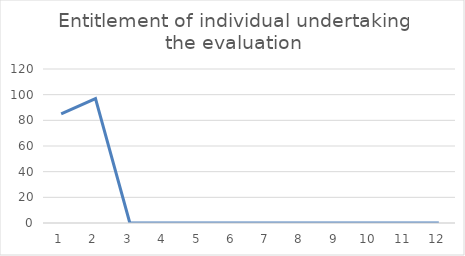
| Category | Entitlement of individual undertaking the evaluation |
|---|---|
| 0 | 85 |
| 1 | 97 |
| 2 | 0 |
| 3 | 0 |
| 4 | 0 |
| 5 | 0 |
| 6 | 0 |
| 7 | 0 |
| 8 | 0 |
| 9 | 0 |
| 10 | 0 |
| 11 | 0 |